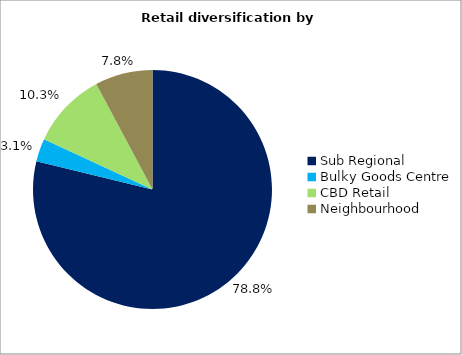
| Category | Series 0 |
|---|---|
| Sub Regional | 0.788 |
| Bulky Goods Centre | 0.031 |
| CBD Retail | 0.103 |
| Neighbourhood | 0.078 |